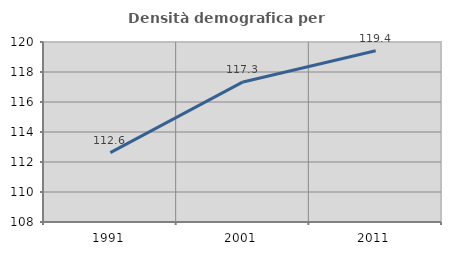
| Category | Densità demografica |
|---|---|
| 1991.0 | 112.623 |
| 2001.0 | 117.339 |
| 2011.0 | 119.417 |